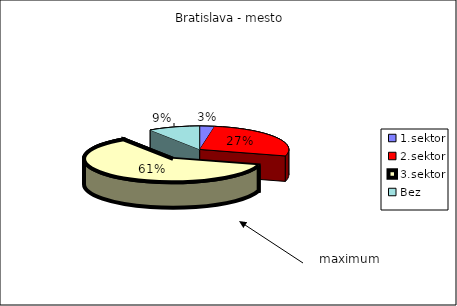
| Category | Bratislava - mesto |
|---|---|
| 1.sektor | 0.027 |
| 2.sektor | 0.268 |
| 3.sektor | 0.611 |
| Bez | 0.094 |